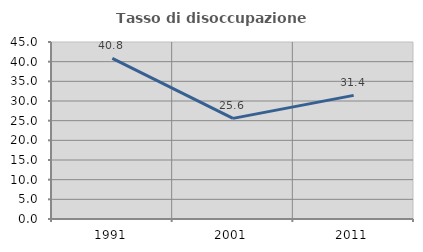
| Category | Tasso di disoccupazione giovanile  |
|---|---|
| 1991.0 | 40.845 |
| 2001.0 | 25.581 |
| 2011.0 | 31.429 |